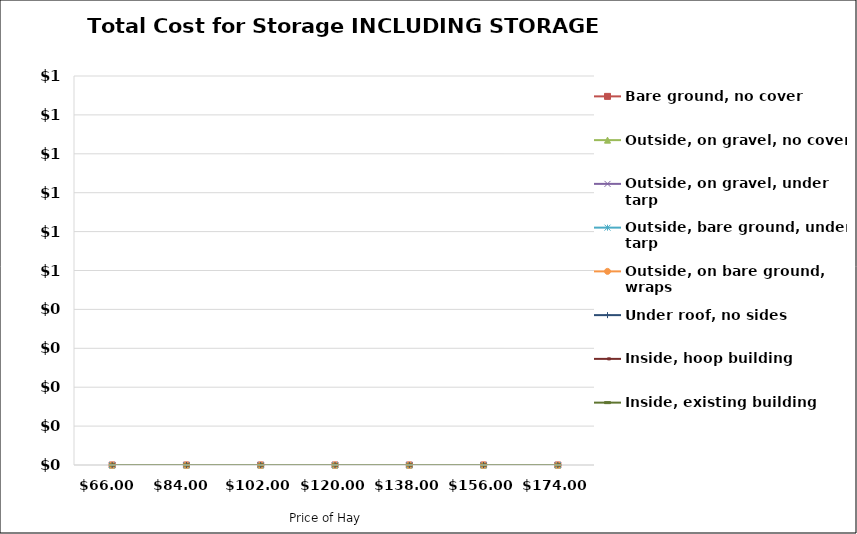
| Category | Bare ground, no cover | Outside, on gravel, no cover | Outside, on gravel, under tarp | Outside, bare ground, under tarp | Outside, on bare ground, wraps | Under roof, no sides | Inside, hoop building | Inside, existing building |
|---|---|---|---|---|---|---|---|---|
| 66.0 | 0 | 0 | 0 | 0 | 0 | 0 | 0 | 0 |
| 84.0 | 0 | 0 | 0 | 0 | 0 | 0 | 0 | 0 |
| 102.0 | 0 | 0 | 0 | 0 | 0 | 0 | 0 | 0 |
| 120.0 | 0 | 0 | 0 | 0 | 0 | 0 | 0 | 0 |
| 138.0 | 0 | 0 | 0 | 0 | 0 | 0 | 0 | 0 |
| 156.0 | 0 | 0 | 0 | 0 | 0 | 0 | 0 | 0 |
| 174.0 | 0 | 0 | 0 | 0 | 0 | 0 | 0 | 0 |